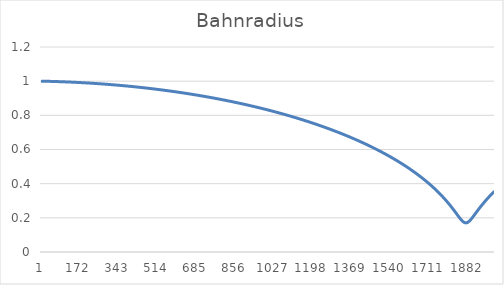
| Category | Series 0 |
|---|---|
| 0 | 1 |
| 1 | 1 |
| 2 | 1 |
| 3 | 1 |
| 4 | 1 |
| 5 | 1 |
| 6 | 1 |
| 7 | 1 |
| 8 | 1 |
| 9 | 1 |
| 10 | 1 |
| 11 | 1 |
| 12 | 1 |
| 13 | 1 |
| 14 | 1 |
| 15 | 1 |
| 16 | 1 |
| 17 | 1 |
| 18 | 1 |
| 19 | 0.999 |
| 20 | 0.999 |
| 21 | 0.999 |
| 22 | 0.999 |
| 23 | 0.999 |
| 24 | 0.999 |
| 25 | 0.999 |
| 26 | 0.999 |
| 27 | 0.999 |
| 28 | 0.999 |
| 29 | 0.999 |
| 30 | 0.999 |
| 31 | 0.999 |
| 32 | 0.999 |
| 33 | 0.999 |
| 34 | 0.999 |
| 35 | 0.999 |
| 36 | 0.999 |
| 37 | 0.999 |
| 38 | 0.999 |
| 39 | 0.999 |
| 40 | 0.999 |
| 41 | 0.999 |
| 42 | 0.999 |
| 43 | 0.999 |
| 44 | 0.999 |
| 45 | 0.999 |
| 46 | 0.999 |
| 47 | 0.999 |
| 48 | 0.998 |
| 49 | 0.998 |
| 50 | 0.998 |
| 51 | 0.998 |
| 52 | 0.998 |
| 53 | 0.998 |
| 54 | 0.998 |
| 55 | 0.998 |
| 56 | 0.998 |
| 57 | 0.998 |
| 58 | 0.998 |
| 59 | 0.998 |
| 60 | 0.998 |
| 61 | 0.998 |
| 62 | 0.998 |
| 63 | 0.998 |
| 64 | 0.998 |
| 65 | 0.998 |
| 66 | 0.998 |
| 67 | 0.998 |
| 68 | 0.998 |
| 69 | 0.998 |
| 70 | 0.998 |
| 71 | 0.998 |
| 72 | 0.998 |
| 73 | 0.997 |
| 74 | 0.997 |
| 75 | 0.997 |
| 76 | 0.997 |
| 77 | 0.997 |
| 78 | 0.997 |
| 79 | 0.997 |
| 80 | 0.997 |
| 81 | 0.997 |
| 82 | 0.997 |
| 83 | 0.997 |
| 84 | 0.997 |
| 85 | 0.997 |
| 86 | 0.997 |
| 87 | 0.997 |
| 88 | 0.997 |
| 89 | 0.997 |
| 90 | 0.997 |
| 91 | 0.997 |
| 92 | 0.997 |
| 93 | 0.997 |
| 94 | 0.996 |
| 95 | 0.996 |
| 96 | 0.996 |
| 97 | 0.996 |
| 98 | 0.996 |
| 99 | 0.996 |
| 100 | 0.996 |
| 101 | 0.996 |
| 102 | 0.996 |
| 103 | 0.996 |
| 104 | 0.996 |
| 105 | 0.996 |
| 106 | 0.996 |
| 107 | 0.996 |
| 108 | 0.996 |
| 109 | 0.996 |
| 110 | 0.996 |
| 111 | 0.996 |
| 112 | 0.996 |
| 113 | 0.995 |
| 114 | 0.995 |
| 115 | 0.995 |
| 116 | 0.995 |
| 117 | 0.995 |
| 118 | 0.995 |
| 119 | 0.995 |
| 120 | 0.995 |
| 121 | 0.995 |
| 122 | 0.995 |
| 123 | 0.995 |
| 124 | 0.995 |
| 125 | 0.995 |
| 126 | 0.995 |
| 127 | 0.995 |
| 128 | 0.995 |
| 129 | 0.995 |
| 130 | 0.995 |
| 131 | 0.994 |
| 132 | 0.994 |
| 133 | 0.994 |
| 134 | 0.994 |
| 135 | 0.994 |
| 136 | 0.994 |
| 137 | 0.994 |
| 138 | 0.994 |
| 139 | 0.994 |
| 140 | 0.994 |
| 141 | 0.994 |
| 142 | 0.994 |
| 143 | 0.994 |
| 144 | 0.994 |
| 145 | 0.994 |
| 146 | 0.994 |
| 147 | 0.993 |
| 148 | 0.993 |
| 149 | 0.993 |
| 150 | 0.993 |
| 151 | 0.993 |
| 152 | 0.993 |
| 153 | 0.993 |
| 154 | 0.993 |
| 155 | 0.993 |
| 156 | 0.993 |
| 157 | 0.993 |
| 158 | 0.993 |
| 159 | 0.993 |
| 160 | 0.993 |
| 161 | 0.993 |
| 162 | 0.992 |
| 163 | 0.992 |
| 164 | 0.992 |
| 165 | 0.992 |
| 166 | 0.992 |
| 167 | 0.992 |
| 168 | 0.992 |
| 169 | 0.992 |
| 170 | 0.992 |
| 171 | 0.992 |
| 172 | 0.992 |
| 173 | 0.992 |
| 174 | 0.992 |
| 175 | 0.992 |
| 176 | 0.992 |
| 177 | 0.991 |
| 178 | 0.991 |
| 179 | 0.991 |
| 180 | 0.991 |
| 181 | 0.991 |
| 182 | 0.991 |
| 183 | 0.991 |
| 184 | 0.991 |
| 185 | 0.991 |
| 186 | 0.991 |
| 187 | 0.991 |
| 188 | 0.991 |
| 189 | 0.991 |
| 190 | 0.99 |
| 191 | 0.99 |
| 192 | 0.99 |
| 193 | 0.99 |
| 194 | 0.99 |
| 195 | 0.99 |
| 196 | 0.99 |
| 197 | 0.99 |
| 198 | 0.99 |
| 199 | 0.99 |
| 200 | 0.99 |
| 201 | 0.99 |
| 202 | 0.99 |
| 203 | 0.989 |
| 204 | 0.989 |
| 205 | 0.989 |
| 206 | 0.989 |
| 207 | 0.989 |
| 208 | 0.989 |
| 209 | 0.989 |
| 210 | 0.989 |
| 211 | 0.989 |
| 212 | 0.989 |
| 213 | 0.989 |
| 214 | 0.989 |
| 215 | 0.989 |
| 216 | 0.988 |
| 217 | 0.988 |
| 218 | 0.988 |
| 219 | 0.988 |
| 220 | 0.988 |
| 221 | 0.988 |
| 222 | 0.988 |
| 223 | 0.988 |
| 224 | 0.988 |
| 225 | 0.988 |
| 226 | 0.988 |
| 227 | 0.988 |
| 228 | 0.987 |
| 229 | 0.987 |
| 230 | 0.987 |
| 231 | 0.987 |
| 232 | 0.987 |
| 233 | 0.987 |
| 234 | 0.987 |
| 235 | 0.987 |
| 236 | 0.987 |
| 237 | 0.987 |
| 238 | 0.987 |
| 239 | 0.986 |
| 240 | 0.986 |
| 241 | 0.986 |
| 242 | 0.986 |
| 243 | 0.986 |
| 244 | 0.986 |
| 245 | 0.986 |
| 246 | 0.986 |
| 247 | 0.986 |
| 248 | 0.986 |
| 249 | 0.986 |
| 250 | 0.986 |
| 251 | 0.985 |
| 252 | 0.985 |
| 253 | 0.985 |
| 254 | 0.985 |
| 255 | 0.985 |
| 256 | 0.985 |
| 257 | 0.985 |
| 258 | 0.985 |
| 259 | 0.985 |
| 260 | 0.985 |
| 261 | 0.984 |
| 262 | 0.984 |
| 263 | 0.984 |
| 264 | 0.984 |
| 265 | 0.984 |
| 266 | 0.984 |
| 267 | 0.984 |
| 268 | 0.984 |
| 269 | 0.984 |
| 270 | 0.984 |
| 271 | 0.984 |
| 272 | 0.983 |
| 273 | 0.983 |
| 274 | 0.983 |
| 275 | 0.983 |
| 276 | 0.983 |
| 277 | 0.983 |
| 278 | 0.983 |
| 279 | 0.983 |
| 280 | 0.983 |
| 281 | 0.983 |
| 282 | 0.982 |
| 283 | 0.982 |
| 284 | 0.982 |
| 285 | 0.982 |
| 286 | 0.982 |
| 287 | 0.982 |
| 288 | 0.982 |
| 289 | 0.982 |
| 290 | 0.982 |
| 291 | 0.982 |
| 292 | 0.981 |
| 293 | 0.981 |
| 294 | 0.981 |
| 295 | 0.981 |
| 296 | 0.981 |
| 297 | 0.981 |
| 298 | 0.981 |
| 299 | 0.981 |
| 300 | 0.981 |
| 301 | 0.98 |
| 302 | 0.98 |
| 303 | 0.98 |
| 304 | 0.98 |
| 305 | 0.98 |
| 306 | 0.98 |
| 307 | 0.98 |
| 308 | 0.98 |
| 309 | 0.98 |
| 310 | 0.98 |
| 311 | 0.979 |
| 312 | 0.979 |
| 313 | 0.979 |
| 314 | 0.979 |
| 315 | 0.979 |
| 316 | 0.979 |
| 317 | 0.979 |
| 318 | 0.979 |
| 319 | 0.979 |
| 320 | 0.978 |
| 321 | 0.978 |
| 322 | 0.978 |
| 323 | 0.978 |
| 324 | 0.978 |
| 325 | 0.978 |
| 326 | 0.978 |
| 327 | 0.978 |
| 328 | 0.978 |
| 329 | 0.977 |
| 330 | 0.977 |
| 331 | 0.977 |
| 332 | 0.977 |
| 333 | 0.977 |
| 334 | 0.977 |
| 335 | 0.977 |
| 336 | 0.977 |
| 337 | 0.977 |
| 338 | 0.976 |
| 339 | 0.976 |
| 340 | 0.976 |
| 341 | 0.976 |
| 342 | 0.976 |
| 343 | 0.976 |
| 344 | 0.976 |
| 345 | 0.976 |
| 346 | 0.975 |
| 347 | 0.975 |
| 348 | 0.975 |
| 349 | 0.975 |
| 350 | 0.975 |
| 351 | 0.975 |
| 352 | 0.975 |
| 353 | 0.975 |
| 354 | 0.975 |
| 355 | 0.974 |
| 356 | 0.974 |
| 357 | 0.974 |
| 358 | 0.974 |
| 359 | 0.974 |
| 360 | 0.974 |
| 361 | 0.974 |
| 362 | 0.974 |
| 363 | 0.973 |
| 364 | 0.973 |
| 365 | 0.973 |
| 366 | 0.973 |
| 367 | 0.973 |
| 368 | 0.973 |
| 369 | 0.973 |
| 370 | 0.973 |
| 371 | 0.972 |
| 372 | 0.972 |
| 373 | 0.972 |
| 374 | 0.972 |
| 375 | 0.972 |
| 376 | 0.972 |
| 377 | 0.972 |
| 378 | 0.972 |
| 379 | 0.971 |
| 380 | 0.971 |
| 381 | 0.971 |
| 382 | 0.971 |
| 383 | 0.971 |
| 384 | 0.971 |
| 385 | 0.971 |
| 386 | 0.971 |
| 387 | 0.97 |
| 388 | 0.97 |
| 389 | 0.97 |
| 390 | 0.97 |
| 391 | 0.97 |
| 392 | 0.97 |
| 393 | 0.97 |
| 394 | 0.97 |
| 395 | 0.969 |
| 396 | 0.969 |
| 397 | 0.969 |
| 398 | 0.969 |
| 399 | 0.969 |
| 400 | 0.969 |
| 401 | 0.969 |
| 402 | 0.968 |
| 403 | 0.968 |
| 404 | 0.968 |
| 405 | 0.968 |
| 406 | 0.968 |
| 407 | 0.968 |
| 408 | 0.968 |
| 409 | 0.968 |
| 410 | 0.967 |
| 411 | 0.967 |
| 412 | 0.967 |
| 413 | 0.967 |
| 414 | 0.967 |
| 415 | 0.967 |
| 416 | 0.967 |
| 417 | 0.966 |
| 418 | 0.966 |
| 419 | 0.966 |
| 420 | 0.966 |
| 421 | 0.966 |
| 422 | 0.966 |
| 423 | 0.966 |
| 424 | 0.965 |
| 425 | 0.965 |
| 426 | 0.965 |
| 427 | 0.965 |
| 428 | 0.965 |
| 429 | 0.965 |
| 430 | 0.965 |
| 431 | 0.964 |
| 432 | 0.964 |
| 433 | 0.964 |
| 434 | 0.964 |
| 435 | 0.964 |
| 436 | 0.964 |
| 437 | 0.964 |
| 438 | 0.963 |
| 439 | 0.963 |
| 440 | 0.963 |
| 441 | 0.963 |
| 442 | 0.963 |
| 443 | 0.963 |
| 444 | 0.963 |
| 445 | 0.962 |
| 446 | 0.962 |
| 447 | 0.962 |
| 448 | 0.962 |
| 449 | 0.962 |
| 450 | 0.962 |
| 451 | 0.962 |
| 452 | 0.961 |
| 453 | 0.961 |
| 454 | 0.961 |
| 455 | 0.961 |
| 456 | 0.961 |
| 457 | 0.961 |
| 458 | 0.961 |
| 459 | 0.96 |
| 460 | 0.96 |
| 461 | 0.96 |
| 462 | 0.96 |
| 463 | 0.96 |
| 464 | 0.96 |
| 465 | 0.959 |
| 466 | 0.959 |
| 467 | 0.959 |
| 468 | 0.959 |
| 469 | 0.959 |
| 470 | 0.959 |
| 471 | 0.959 |
| 472 | 0.958 |
| 473 | 0.958 |
| 474 | 0.958 |
| 475 | 0.958 |
| 476 | 0.958 |
| 477 | 0.958 |
| 478 | 0.957 |
| 479 | 0.957 |
| 480 | 0.957 |
| 481 | 0.957 |
| 482 | 0.957 |
| 483 | 0.957 |
| 484 | 0.957 |
| 485 | 0.956 |
| 486 | 0.956 |
| 487 | 0.956 |
| 488 | 0.956 |
| 489 | 0.956 |
| 490 | 0.956 |
| 491 | 0.955 |
| 492 | 0.955 |
| 493 | 0.955 |
| 494 | 0.955 |
| 495 | 0.955 |
| 496 | 0.955 |
| 497 | 0.954 |
| 498 | 0.954 |
| 499 | 0.954 |
| 500 | 0.954 |
| 501 | 0.954 |
| 502 | 0.954 |
| 503 | 0.953 |
| 504 | 0.953 |
| 505 | 0.953 |
| 506 | 0.953 |
| 507 | 0.953 |
| 508 | 0.953 |
| 509 | 0.953 |
| 510 | 0.952 |
| 511 | 0.952 |
| 512 | 0.952 |
| 513 | 0.952 |
| 514 | 0.952 |
| 515 | 0.952 |
| 516 | 0.951 |
| 517 | 0.951 |
| 518 | 0.951 |
| 519 | 0.951 |
| 520 | 0.951 |
| 521 | 0.951 |
| 522 | 0.95 |
| 523 | 0.95 |
| 524 | 0.95 |
| 525 | 0.95 |
| 526 | 0.95 |
| 527 | 0.949 |
| 528 | 0.949 |
| 529 | 0.949 |
| 530 | 0.949 |
| 531 | 0.949 |
| 532 | 0.949 |
| 533 | 0.948 |
| 534 | 0.948 |
| 535 | 0.948 |
| 536 | 0.948 |
| 537 | 0.948 |
| 538 | 0.948 |
| 539 | 0.947 |
| 540 | 0.947 |
| 541 | 0.947 |
| 542 | 0.947 |
| 543 | 0.947 |
| 544 | 0.947 |
| 545 | 0.946 |
| 546 | 0.946 |
| 547 | 0.946 |
| 548 | 0.946 |
| 549 | 0.946 |
| 550 | 0.945 |
| 551 | 0.945 |
| 552 | 0.945 |
| 553 | 0.945 |
| 554 | 0.945 |
| 555 | 0.945 |
| 556 | 0.944 |
| 557 | 0.944 |
| 558 | 0.944 |
| 559 | 0.944 |
| 560 | 0.944 |
| 561 | 0.944 |
| 562 | 0.943 |
| 563 | 0.943 |
| 564 | 0.943 |
| 565 | 0.943 |
| 566 | 0.943 |
| 567 | 0.942 |
| 568 | 0.942 |
| 569 | 0.942 |
| 570 | 0.942 |
| 571 | 0.942 |
| 572 | 0.942 |
| 573 | 0.941 |
| 574 | 0.941 |
| 575 | 0.941 |
| 576 | 0.941 |
| 577 | 0.941 |
| 578 | 0.94 |
| 579 | 0.94 |
| 580 | 0.94 |
| 581 | 0.94 |
| 582 | 0.94 |
| 583 | 0.939 |
| 584 | 0.939 |
| 585 | 0.939 |
| 586 | 0.939 |
| 587 | 0.939 |
| 588 | 0.939 |
| 589 | 0.938 |
| 590 | 0.938 |
| 591 | 0.938 |
| 592 | 0.938 |
| 593 | 0.938 |
| 594 | 0.937 |
| 595 | 0.937 |
| 596 | 0.937 |
| 597 | 0.937 |
| 598 | 0.937 |
| 599 | 0.936 |
| 600 | 0.936 |
| 601 | 0.936 |
| 602 | 0.936 |
| 603 | 0.936 |
| 604 | 0.935 |
| 605 | 0.935 |
| 606 | 0.935 |
| 607 | 0.935 |
| 608 | 0.935 |
| 609 | 0.934 |
| 610 | 0.934 |
| 611 | 0.934 |
| 612 | 0.934 |
| 613 | 0.934 |
| 614 | 0.934 |
| 615 | 0.933 |
| 616 | 0.933 |
| 617 | 0.933 |
| 618 | 0.933 |
| 619 | 0.933 |
| 620 | 0.932 |
| 621 | 0.932 |
| 622 | 0.932 |
| 623 | 0.932 |
| 624 | 0.932 |
| 625 | 0.931 |
| 626 | 0.931 |
| 627 | 0.931 |
| 628 | 0.931 |
| 629 | 0.931 |
| 630 | 0.93 |
| 631 | 0.93 |
| 632 | 0.93 |
| 633 | 0.93 |
| 634 | 0.929 |
| 635 | 0.929 |
| 636 | 0.929 |
| 637 | 0.929 |
| 638 | 0.929 |
| 639 | 0.928 |
| 640 | 0.928 |
| 641 | 0.928 |
| 642 | 0.928 |
| 643 | 0.928 |
| 644 | 0.927 |
| 645 | 0.927 |
| 646 | 0.927 |
| 647 | 0.927 |
| 648 | 0.927 |
| 649 | 0.926 |
| 650 | 0.926 |
| 651 | 0.926 |
| 652 | 0.926 |
| 653 | 0.926 |
| 654 | 0.925 |
| 655 | 0.925 |
| 656 | 0.925 |
| 657 | 0.925 |
| 658 | 0.925 |
| 659 | 0.924 |
| 660 | 0.924 |
| 661 | 0.924 |
| 662 | 0.924 |
| 663 | 0.923 |
| 664 | 0.923 |
| 665 | 0.923 |
| 666 | 0.923 |
| 667 | 0.923 |
| 668 | 0.922 |
| 669 | 0.922 |
| 670 | 0.922 |
| 671 | 0.922 |
| 672 | 0.922 |
| 673 | 0.921 |
| 674 | 0.921 |
| 675 | 0.921 |
| 676 | 0.921 |
| 677 | 0.92 |
| 678 | 0.92 |
| 679 | 0.92 |
| 680 | 0.92 |
| 681 | 0.92 |
| 682 | 0.919 |
| 683 | 0.919 |
| 684 | 0.919 |
| 685 | 0.919 |
| 686 | 0.918 |
| 687 | 0.918 |
| 688 | 0.918 |
| 689 | 0.918 |
| 690 | 0.918 |
| 691 | 0.917 |
| 692 | 0.917 |
| 693 | 0.917 |
| 694 | 0.917 |
| 695 | 0.916 |
| 696 | 0.916 |
| 697 | 0.916 |
| 698 | 0.916 |
| 699 | 0.916 |
| 700 | 0.915 |
| 701 | 0.915 |
| 702 | 0.915 |
| 703 | 0.915 |
| 704 | 0.914 |
| 705 | 0.914 |
| 706 | 0.914 |
| 707 | 0.914 |
| 708 | 0.914 |
| 709 | 0.913 |
| 710 | 0.913 |
| 711 | 0.913 |
| 712 | 0.913 |
| 713 | 0.912 |
| 714 | 0.912 |
| 715 | 0.912 |
| 716 | 0.912 |
| 717 | 0.911 |
| 718 | 0.911 |
| 719 | 0.911 |
| 720 | 0.911 |
| 721 | 0.911 |
| 722 | 0.91 |
| 723 | 0.91 |
| 724 | 0.91 |
| 725 | 0.91 |
| 726 | 0.909 |
| 727 | 0.909 |
| 728 | 0.909 |
| 729 | 0.909 |
| 730 | 0.908 |
| 731 | 0.908 |
| 732 | 0.908 |
| 733 | 0.908 |
| 734 | 0.907 |
| 735 | 0.907 |
| 736 | 0.907 |
| 737 | 0.907 |
| 738 | 0.907 |
| 739 | 0.906 |
| 740 | 0.906 |
| 741 | 0.906 |
| 742 | 0.906 |
| 743 | 0.905 |
| 744 | 0.905 |
| 745 | 0.905 |
| 746 | 0.905 |
| 747 | 0.904 |
| 748 | 0.904 |
| 749 | 0.904 |
| 750 | 0.904 |
| 751 | 0.903 |
| 752 | 0.903 |
| 753 | 0.903 |
| 754 | 0.903 |
| 755 | 0.902 |
| 756 | 0.902 |
| 757 | 0.902 |
| 758 | 0.902 |
| 759 | 0.901 |
| 760 | 0.901 |
| 761 | 0.901 |
| 762 | 0.901 |
| 763 | 0.9 |
| 764 | 0.9 |
| 765 | 0.9 |
| 766 | 0.9 |
| 767 | 0.899 |
| 768 | 0.899 |
| 769 | 0.899 |
| 770 | 0.899 |
| 771 | 0.898 |
| 772 | 0.898 |
| 773 | 0.898 |
| 774 | 0.898 |
| 775 | 0.897 |
| 776 | 0.897 |
| 777 | 0.897 |
| 778 | 0.897 |
| 779 | 0.896 |
| 780 | 0.896 |
| 781 | 0.896 |
| 782 | 0.896 |
| 783 | 0.895 |
| 784 | 0.895 |
| 785 | 0.895 |
| 786 | 0.895 |
| 787 | 0.894 |
| 788 | 0.894 |
| 789 | 0.894 |
| 790 | 0.894 |
| 791 | 0.893 |
| 792 | 0.893 |
| 793 | 0.893 |
| 794 | 0.893 |
| 795 | 0.892 |
| 796 | 0.892 |
| 797 | 0.892 |
| 798 | 0.892 |
| 799 | 0.891 |
| 800 | 0.891 |
| 801 | 0.891 |
| 802 | 0.891 |
| 803 | 0.89 |
| 804 | 0.89 |
| 805 | 0.89 |
| 806 | 0.889 |
| 807 | 0.889 |
| 808 | 0.889 |
| 809 | 0.889 |
| 810 | 0.888 |
| 811 | 0.888 |
| 812 | 0.888 |
| 813 | 0.888 |
| 814 | 0.887 |
| 815 | 0.887 |
| 816 | 0.887 |
| 817 | 0.887 |
| 818 | 0.886 |
| 819 | 0.886 |
| 820 | 0.886 |
| 821 | 0.885 |
| 822 | 0.885 |
| 823 | 0.885 |
| 824 | 0.885 |
| 825 | 0.884 |
| 826 | 0.884 |
| 827 | 0.884 |
| 828 | 0.884 |
| 829 | 0.883 |
| 830 | 0.883 |
| 831 | 0.883 |
| 832 | 0.883 |
| 833 | 0.882 |
| 834 | 0.882 |
| 835 | 0.882 |
| 836 | 0.881 |
| 837 | 0.881 |
| 838 | 0.881 |
| 839 | 0.881 |
| 840 | 0.88 |
| 841 | 0.88 |
| 842 | 0.88 |
| 843 | 0.879 |
| 844 | 0.879 |
| 845 | 0.879 |
| 846 | 0.879 |
| 847 | 0.878 |
| 848 | 0.878 |
| 849 | 0.878 |
| 850 | 0.878 |
| 851 | 0.877 |
| 852 | 0.877 |
| 853 | 0.877 |
| 854 | 0.876 |
| 855 | 0.876 |
| 856 | 0.876 |
| 857 | 0.876 |
| 858 | 0.875 |
| 859 | 0.875 |
| 860 | 0.875 |
| 861 | 0.874 |
| 862 | 0.874 |
| 863 | 0.874 |
| 864 | 0.874 |
| 865 | 0.873 |
| 866 | 0.873 |
| 867 | 0.873 |
| 868 | 0.872 |
| 869 | 0.872 |
| 870 | 0.872 |
| 871 | 0.872 |
| 872 | 0.871 |
| 873 | 0.871 |
| 874 | 0.871 |
| 875 | 0.87 |
| 876 | 0.87 |
| 877 | 0.87 |
| 878 | 0.87 |
| 879 | 0.869 |
| 880 | 0.869 |
| 881 | 0.869 |
| 882 | 0.868 |
| 883 | 0.868 |
| 884 | 0.868 |
| 885 | 0.868 |
| 886 | 0.867 |
| 887 | 0.867 |
| 888 | 0.867 |
| 889 | 0.866 |
| 890 | 0.866 |
| 891 | 0.866 |
| 892 | 0.865 |
| 893 | 0.865 |
| 894 | 0.865 |
| 895 | 0.865 |
| 896 | 0.864 |
| 897 | 0.864 |
| 898 | 0.864 |
| 899 | 0.863 |
| 900 | 0.863 |
| 901 | 0.863 |
| 902 | 0.862 |
| 903 | 0.862 |
| 904 | 0.862 |
| 905 | 0.862 |
| 906 | 0.861 |
| 907 | 0.861 |
| 908 | 0.861 |
| 909 | 0.86 |
| 910 | 0.86 |
| 911 | 0.86 |
| 912 | 0.859 |
| 913 | 0.859 |
| 914 | 0.859 |
| 915 | 0.859 |
| 916 | 0.858 |
| 917 | 0.858 |
| 918 | 0.858 |
| 919 | 0.857 |
| 920 | 0.857 |
| 921 | 0.857 |
| 922 | 0.856 |
| 923 | 0.856 |
| 924 | 0.856 |
| 925 | 0.855 |
| 926 | 0.855 |
| 927 | 0.855 |
| 928 | 0.855 |
| 929 | 0.854 |
| 930 | 0.854 |
| 931 | 0.854 |
| 932 | 0.853 |
| 933 | 0.853 |
| 934 | 0.853 |
| 935 | 0.852 |
| 936 | 0.852 |
| 937 | 0.852 |
| 938 | 0.851 |
| 939 | 0.851 |
| 940 | 0.851 |
| 941 | 0.85 |
| 942 | 0.85 |
| 943 | 0.85 |
| 944 | 0.85 |
| 945 | 0.849 |
| 946 | 0.849 |
| 947 | 0.849 |
| 948 | 0.848 |
| 949 | 0.848 |
| 950 | 0.848 |
| 951 | 0.847 |
| 952 | 0.847 |
| 953 | 0.847 |
| 954 | 0.846 |
| 955 | 0.846 |
| 956 | 0.846 |
| 957 | 0.845 |
| 958 | 0.845 |
| 959 | 0.845 |
| 960 | 0.844 |
| 961 | 0.844 |
| 962 | 0.844 |
| 963 | 0.843 |
| 964 | 0.843 |
| 965 | 0.843 |
| 966 | 0.842 |
| 967 | 0.842 |
| 968 | 0.842 |
| 969 | 0.841 |
| 970 | 0.841 |
| 971 | 0.841 |
| 972 | 0.84 |
| 973 | 0.84 |
| 974 | 0.84 |
| 975 | 0.839 |
| 976 | 0.839 |
| 977 | 0.839 |
| 978 | 0.838 |
| 979 | 0.838 |
| 980 | 0.838 |
| 981 | 0.837 |
| 982 | 0.837 |
| 983 | 0.837 |
| 984 | 0.836 |
| 985 | 0.836 |
| 986 | 0.836 |
| 987 | 0.835 |
| 988 | 0.835 |
| 989 | 0.835 |
| 990 | 0.834 |
| 991 | 0.834 |
| 992 | 0.834 |
| 993 | 0.833 |
| 994 | 0.833 |
| 995 | 0.833 |
| 996 | 0.832 |
| 997 | 0.832 |
| 998 | 0.832 |
| 999 | 0.831 |
| 1000 | 0.831 |
| 1001 | 0.831 |
| 1002 | 0.83 |
| 1003 | 0.83 |
| 1004 | 0.83 |
| 1005 | 0.829 |
| 1006 | 0.829 |
| 1007 | 0.829 |
| 1008 | 0.828 |
| 1009 | 0.828 |
| 1010 | 0.828 |
| 1011 | 0.827 |
| 1012 | 0.827 |
| 1013 | 0.827 |
| 1014 | 0.826 |
| 1015 | 0.826 |
| 1016 | 0.826 |
| 1017 | 0.825 |
| 1018 | 0.825 |
| 1019 | 0.825 |
| 1020 | 0.824 |
| 1021 | 0.824 |
| 1022 | 0.823 |
| 1023 | 0.823 |
| 1024 | 0.823 |
| 1025 | 0.822 |
| 1026 | 0.822 |
| 1027 | 0.822 |
| 1028 | 0.821 |
| 1029 | 0.821 |
| 1030 | 0.821 |
| 1031 | 0.82 |
| 1032 | 0.82 |
| 1033 | 0.82 |
| 1034 | 0.819 |
| 1035 | 0.819 |
| 1036 | 0.818 |
| 1037 | 0.818 |
| 1038 | 0.818 |
| 1039 | 0.817 |
| 1040 | 0.817 |
| 1041 | 0.817 |
| 1042 | 0.816 |
| 1043 | 0.816 |
| 1044 | 0.816 |
| 1045 | 0.815 |
| 1046 | 0.815 |
| 1047 | 0.815 |
| 1048 | 0.814 |
| 1049 | 0.814 |
| 1050 | 0.813 |
| 1051 | 0.813 |
| 1052 | 0.813 |
| 1053 | 0.812 |
| 1054 | 0.812 |
| 1055 | 0.812 |
| 1056 | 0.811 |
| 1057 | 0.811 |
| 1058 | 0.81 |
| 1059 | 0.81 |
| 1060 | 0.81 |
| 1061 | 0.809 |
| 1062 | 0.809 |
| 1063 | 0.809 |
| 1064 | 0.808 |
| 1065 | 0.808 |
| 1066 | 0.808 |
| 1067 | 0.807 |
| 1068 | 0.807 |
| 1069 | 0.806 |
| 1070 | 0.806 |
| 1071 | 0.806 |
| 1072 | 0.805 |
| 1073 | 0.805 |
| 1074 | 0.805 |
| 1075 | 0.804 |
| 1076 | 0.804 |
| 1077 | 0.803 |
| 1078 | 0.803 |
| 1079 | 0.803 |
| 1080 | 0.802 |
| 1081 | 0.802 |
| 1082 | 0.801 |
| 1083 | 0.801 |
| 1084 | 0.801 |
| 1085 | 0.8 |
| 1086 | 0.8 |
| 1087 | 0.8 |
| 1088 | 0.799 |
| 1089 | 0.799 |
| 1090 | 0.798 |
| 1091 | 0.798 |
| 1092 | 0.798 |
| 1093 | 0.797 |
| 1094 | 0.797 |
| 1095 | 0.796 |
| 1096 | 0.796 |
| 1097 | 0.796 |
| 1098 | 0.795 |
| 1099 | 0.795 |
| 1100 | 0.795 |
| 1101 | 0.794 |
| 1102 | 0.794 |
| 1103 | 0.793 |
| 1104 | 0.793 |
| 1105 | 0.793 |
| 1106 | 0.792 |
| 1107 | 0.792 |
| 1108 | 0.791 |
| 1109 | 0.791 |
| 1110 | 0.791 |
| 1111 | 0.79 |
| 1112 | 0.79 |
| 1113 | 0.789 |
| 1114 | 0.789 |
| 1115 | 0.789 |
| 1116 | 0.788 |
| 1117 | 0.788 |
| 1118 | 0.787 |
| 1119 | 0.787 |
| 1120 | 0.787 |
| 1121 | 0.786 |
| 1122 | 0.786 |
| 1123 | 0.785 |
| 1124 | 0.785 |
| 1125 | 0.785 |
| 1126 | 0.784 |
| 1127 | 0.784 |
| 1128 | 0.783 |
| 1129 | 0.783 |
| 1130 | 0.783 |
| 1131 | 0.782 |
| 1132 | 0.782 |
| 1133 | 0.781 |
| 1134 | 0.781 |
| 1135 | 0.781 |
| 1136 | 0.78 |
| 1137 | 0.78 |
| 1138 | 0.779 |
| 1139 | 0.779 |
| 1140 | 0.779 |
| 1141 | 0.778 |
| 1142 | 0.778 |
| 1143 | 0.777 |
| 1144 | 0.777 |
| 1145 | 0.776 |
| 1146 | 0.776 |
| 1147 | 0.776 |
| 1148 | 0.775 |
| 1149 | 0.775 |
| 1150 | 0.774 |
| 1151 | 0.774 |
| 1152 | 0.774 |
| 1153 | 0.773 |
| 1154 | 0.773 |
| 1155 | 0.772 |
| 1156 | 0.772 |
| 1157 | 0.771 |
| 1158 | 0.771 |
| 1159 | 0.771 |
| 1160 | 0.77 |
| 1161 | 0.77 |
| 1162 | 0.769 |
| 1163 | 0.769 |
| 1164 | 0.769 |
| 1165 | 0.768 |
| 1166 | 0.768 |
| 1167 | 0.767 |
| 1168 | 0.767 |
| 1169 | 0.766 |
| 1170 | 0.766 |
| 1171 | 0.766 |
| 1172 | 0.765 |
| 1173 | 0.765 |
| 1174 | 0.764 |
| 1175 | 0.764 |
| 1176 | 0.763 |
| 1177 | 0.763 |
| 1178 | 0.763 |
| 1179 | 0.762 |
| 1180 | 0.762 |
| 1181 | 0.761 |
| 1182 | 0.761 |
| 1183 | 0.76 |
| 1184 | 0.76 |
| 1185 | 0.759 |
| 1186 | 0.759 |
| 1187 | 0.759 |
| 1188 | 0.758 |
| 1189 | 0.758 |
| 1190 | 0.757 |
| 1191 | 0.757 |
| 1192 | 0.756 |
| 1193 | 0.756 |
| 1194 | 0.756 |
| 1195 | 0.755 |
| 1196 | 0.755 |
| 1197 | 0.754 |
| 1198 | 0.754 |
| 1199 | 0.753 |
| 1200 | 0.753 |
| 1201 | 0.752 |
| 1202 | 0.752 |
| 1203 | 0.752 |
| 1204 | 0.751 |
| 1205 | 0.751 |
| 1206 | 0.75 |
| 1207 | 0.75 |
| 1208 | 0.749 |
| 1209 | 0.749 |
| 1210 | 0.748 |
| 1211 | 0.748 |
| 1212 | 0.747 |
| 1213 | 0.747 |
| 1214 | 0.747 |
| 1215 | 0.746 |
| 1216 | 0.746 |
| 1217 | 0.745 |
| 1218 | 0.745 |
| 1219 | 0.744 |
| 1220 | 0.744 |
| 1221 | 0.743 |
| 1222 | 0.743 |
| 1223 | 0.742 |
| 1224 | 0.742 |
| 1225 | 0.742 |
| 1226 | 0.741 |
| 1227 | 0.741 |
| 1228 | 0.74 |
| 1229 | 0.74 |
| 1230 | 0.739 |
| 1231 | 0.739 |
| 1232 | 0.738 |
| 1233 | 0.738 |
| 1234 | 0.737 |
| 1235 | 0.737 |
| 1236 | 0.736 |
| 1237 | 0.736 |
| 1238 | 0.735 |
| 1239 | 0.735 |
| 1240 | 0.735 |
| 1241 | 0.734 |
| 1242 | 0.734 |
| 1243 | 0.733 |
| 1244 | 0.733 |
| 1245 | 0.732 |
| 1246 | 0.732 |
| 1247 | 0.731 |
| 1248 | 0.731 |
| 1249 | 0.73 |
| 1250 | 0.73 |
| 1251 | 0.729 |
| 1252 | 0.729 |
| 1253 | 0.728 |
| 1254 | 0.728 |
| 1255 | 0.727 |
| 1256 | 0.727 |
| 1257 | 0.726 |
| 1258 | 0.726 |
| 1259 | 0.725 |
| 1260 | 0.725 |
| 1261 | 0.724 |
| 1262 | 0.724 |
| 1263 | 0.724 |
| 1264 | 0.723 |
| 1265 | 0.723 |
| 1266 | 0.722 |
| 1267 | 0.722 |
| 1268 | 0.721 |
| 1269 | 0.721 |
| 1270 | 0.72 |
| 1271 | 0.72 |
| 1272 | 0.719 |
| 1273 | 0.719 |
| 1274 | 0.718 |
| 1275 | 0.718 |
| 1276 | 0.717 |
| 1277 | 0.717 |
| 1278 | 0.716 |
| 1279 | 0.716 |
| 1280 | 0.715 |
| 1281 | 0.715 |
| 1282 | 0.714 |
| 1283 | 0.714 |
| 1284 | 0.713 |
| 1285 | 0.713 |
| 1286 | 0.712 |
| 1287 | 0.712 |
| 1288 | 0.711 |
| 1289 | 0.711 |
| 1290 | 0.71 |
| 1291 | 0.71 |
| 1292 | 0.709 |
| 1293 | 0.709 |
| 1294 | 0.708 |
| 1295 | 0.708 |
| 1296 | 0.707 |
| 1297 | 0.707 |
| 1298 | 0.706 |
| 1299 | 0.706 |
| 1300 | 0.705 |
| 1301 | 0.705 |
| 1302 | 0.704 |
| 1303 | 0.704 |
| 1304 | 0.703 |
| 1305 | 0.702 |
| 1306 | 0.702 |
| 1307 | 0.701 |
| 1308 | 0.701 |
| 1309 | 0.7 |
| 1310 | 0.7 |
| 1311 | 0.699 |
| 1312 | 0.699 |
| 1313 | 0.698 |
| 1314 | 0.698 |
| 1315 | 0.697 |
| 1316 | 0.697 |
| 1317 | 0.696 |
| 1318 | 0.696 |
| 1319 | 0.695 |
| 1320 | 0.695 |
| 1321 | 0.694 |
| 1322 | 0.694 |
| 1323 | 0.693 |
| 1324 | 0.693 |
| 1325 | 0.692 |
| 1326 | 0.691 |
| 1327 | 0.691 |
| 1328 | 0.69 |
| 1329 | 0.69 |
| 1330 | 0.689 |
| 1331 | 0.689 |
| 1332 | 0.688 |
| 1333 | 0.688 |
| 1334 | 0.687 |
| 1335 | 0.687 |
| 1336 | 0.686 |
| 1337 | 0.686 |
| 1338 | 0.685 |
| 1339 | 0.685 |
| 1340 | 0.684 |
| 1341 | 0.683 |
| 1342 | 0.683 |
| 1343 | 0.682 |
| 1344 | 0.682 |
| 1345 | 0.681 |
| 1346 | 0.681 |
| 1347 | 0.68 |
| 1348 | 0.68 |
| 1349 | 0.679 |
| 1350 | 0.678 |
| 1351 | 0.678 |
| 1352 | 0.677 |
| 1353 | 0.677 |
| 1354 | 0.676 |
| 1355 | 0.676 |
| 1356 | 0.675 |
| 1357 | 0.675 |
| 1358 | 0.674 |
| 1359 | 0.673 |
| 1360 | 0.673 |
| 1361 | 0.672 |
| 1362 | 0.672 |
| 1363 | 0.671 |
| 1364 | 0.671 |
| 1365 | 0.67 |
| 1366 | 0.67 |
| 1367 | 0.669 |
| 1368 | 0.668 |
| 1369 | 0.668 |
| 1370 | 0.667 |
| 1371 | 0.667 |
| 1372 | 0.666 |
| 1373 | 0.666 |
| 1374 | 0.665 |
| 1375 | 0.664 |
| 1376 | 0.664 |
| 1377 | 0.663 |
| 1378 | 0.663 |
| 1379 | 0.662 |
| 1380 | 0.662 |
| 1381 | 0.661 |
| 1382 | 0.66 |
| 1383 | 0.66 |
| 1384 | 0.659 |
| 1385 | 0.659 |
| 1386 | 0.658 |
| 1387 | 0.658 |
| 1388 | 0.657 |
| 1389 | 0.656 |
| 1390 | 0.656 |
| 1391 | 0.655 |
| 1392 | 0.655 |
| 1393 | 0.654 |
| 1394 | 0.653 |
| 1395 | 0.653 |
| 1396 | 0.652 |
| 1397 | 0.652 |
| 1398 | 0.651 |
| 1399 | 0.65 |
| 1400 | 0.65 |
| 1401 | 0.649 |
| 1402 | 0.649 |
| 1403 | 0.648 |
| 1404 | 0.647 |
| 1405 | 0.647 |
| 1406 | 0.646 |
| 1407 | 0.646 |
| 1408 | 0.645 |
| 1409 | 0.644 |
| 1410 | 0.644 |
| 1411 | 0.643 |
| 1412 | 0.643 |
| 1413 | 0.642 |
| 1414 | 0.641 |
| 1415 | 0.641 |
| 1416 | 0.64 |
| 1417 | 0.64 |
| 1418 | 0.639 |
| 1419 | 0.638 |
| 1420 | 0.638 |
| 1421 | 0.637 |
| 1422 | 0.637 |
| 1423 | 0.636 |
| 1424 | 0.635 |
| 1425 | 0.635 |
| 1426 | 0.634 |
| 1427 | 0.633 |
| 1428 | 0.633 |
| 1429 | 0.632 |
| 1430 | 0.632 |
| 1431 | 0.631 |
| 1432 | 0.63 |
| 1433 | 0.63 |
| 1434 | 0.629 |
| 1435 | 0.628 |
| 1436 | 0.628 |
| 1437 | 0.627 |
| 1438 | 0.627 |
| 1439 | 0.626 |
| 1440 | 0.625 |
| 1441 | 0.625 |
| 1442 | 0.624 |
| 1443 | 0.623 |
| 1444 | 0.623 |
| 1445 | 0.622 |
| 1446 | 0.621 |
| 1447 | 0.621 |
| 1448 | 0.62 |
| 1449 | 0.62 |
| 1450 | 0.619 |
| 1451 | 0.618 |
| 1452 | 0.618 |
| 1453 | 0.617 |
| 1454 | 0.616 |
| 1455 | 0.616 |
| 1456 | 0.615 |
| 1457 | 0.614 |
| 1458 | 0.614 |
| 1459 | 0.613 |
| 1460 | 0.612 |
| 1461 | 0.612 |
| 1462 | 0.611 |
| 1463 | 0.61 |
| 1464 | 0.61 |
| 1465 | 0.609 |
| 1466 | 0.608 |
| 1467 | 0.608 |
| 1468 | 0.607 |
| 1469 | 0.606 |
| 1470 | 0.606 |
| 1471 | 0.605 |
| 1472 | 0.604 |
| 1473 | 0.604 |
| 1474 | 0.603 |
| 1475 | 0.602 |
| 1476 | 0.602 |
| 1477 | 0.601 |
| 1478 | 0.6 |
| 1479 | 0.6 |
| 1480 | 0.599 |
| 1481 | 0.598 |
| 1482 | 0.598 |
| 1483 | 0.597 |
| 1484 | 0.596 |
| 1485 | 0.596 |
| 1486 | 0.595 |
| 1487 | 0.594 |
| 1488 | 0.594 |
| 1489 | 0.593 |
| 1490 | 0.592 |
| 1491 | 0.591 |
| 1492 | 0.591 |
| 1493 | 0.59 |
| 1494 | 0.589 |
| 1495 | 0.589 |
| 1496 | 0.588 |
| 1497 | 0.587 |
| 1498 | 0.587 |
| 1499 | 0.586 |
| 1500 | 0.585 |
| 1501 | 0.584 |
| 1502 | 0.584 |
| 1503 | 0.583 |
| 1504 | 0.582 |
| 1505 | 0.582 |
| 1506 | 0.581 |
| 1507 | 0.58 |
| 1508 | 0.58 |
| 1509 | 0.579 |
| 1510 | 0.578 |
| 1511 | 0.577 |
| 1512 | 0.577 |
| 1513 | 0.576 |
| 1514 | 0.575 |
| 1515 | 0.574 |
| 1516 | 0.574 |
| 1517 | 0.573 |
| 1518 | 0.572 |
| 1519 | 0.572 |
| 1520 | 0.571 |
| 1521 | 0.57 |
| 1522 | 0.569 |
| 1523 | 0.569 |
| 1524 | 0.568 |
| 1525 | 0.567 |
| 1526 | 0.566 |
| 1527 | 0.566 |
| 1528 | 0.565 |
| 1529 | 0.564 |
| 1530 | 0.563 |
| 1531 | 0.563 |
| 1532 | 0.562 |
| 1533 | 0.561 |
| 1534 | 0.56 |
| 1535 | 0.56 |
| 1536 | 0.559 |
| 1537 | 0.558 |
| 1538 | 0.557 |
| 1539 | 0.557 |
| 1540 | 0.556 |
| 1541 | 0.555 |
| 1542 | 0.554 |
| 1543 | 0.554 |
| 1544 | 0.553 |
| 1545 | 0.552 |
| 1546 | 0.551 |
| 1547 | 0.551 |
| 1548 | 0.55 |
| 1549 | 0.549 |
| 1550 | 0.548 |
| 1551 | 0.548 |
| 1552 | 0.547 |
| 1553 | 0.546 |
| 1554 | 0.545 |
| 1555 | 0.544 |
| 1556 | 0.544 |
| 1557 | 0.543 |
| 1558 | 0.542 |
| 1559 | 0.541 |
| 1560 | 0.54 |
| 1561 | 0.54 |
| 1562 | 0.539 |
| 1563 | 0.538 |
| 1564 | 0.537 |
| 1565 | 0.537 |
| 1566 | 0.536 |
| 1567 | 0.535 |
| 1568 | 0.534 |
| 1569 | 0.533 |
| 1570 | 0.533 |
| 1571 | 0.532 |
| 1572 | 0.531 |
| 1573 | 0.53 |
| 1574 | 0.529 |
| 1575 | 0.528 |
| 1576 | 0.528 |
| 1577 | 0.527 |
| 1578 | 0.526 |
| 1579 | 0.525 |
| 1580 | 0.524 |
| 1581 | 0.524 |
| 1582 | 0.523 |
| 1583 | 0.522 |
| 1584 | 0.521 |
| 1585 | 0.52 |
| 1586 | 0.519 |
| 1587 | 0.519 |
| 1588 | 0.518 |
| 1589 | 0.517 |
| 1590 | 0.516 |
| 1591 | 0.515 |
| 1592 | 0.514 |
| 1593 | 0.514 |
| 1594 | 0.513 |
| 1595 | 0.512 |
| 1596 | 0.511 |
| 1597 | 0.51 |
| 1598 | 0.509 |
| 1599 | 0.508 |
| 1600 | 0.508 |
| 1601 | 0.507 |
| 1602 | 0.506 |
| 1603 | 0.505 |
| 1604 | 0.504 |
| 1605 | 0.503 |
| 1606 | 0.502 |
| 1607 | 0.501 |
| 1608 | 0.501 |
| 1609 | 0.5 |
| 1610 | 0.499 |
| 1611 | 0.498 |
| 1612 | 0.497 |
| 1613 | 0.496 |
| 1614 | 0.495 |
| 1615 | 0.494 |
| 1616 | 0.494 |
| 1617 | 0.493 |
| 1618 | 0.492 |
| 1619 | 0.491 |
| 1620 | 0.49 |
| 1621 | 0.489 |
| 1622 | 0.488 |
| 1623 | 0.487 |
| 1624 | 0.486 |
| 1625 | 0.485 |
| 1626 | 0.485 |
| 1627 | 0.484 |
| 1628 | 0.483 |
| 1629 | 0.482 |
| 1630 | 0.481 |
| 1631 | 0.48 |
| 1632 | 0.479 |
| 1633 | 0.478 |
| 1634 | 0.477 |
| 1635 | 0.476 |
| 1636 | 0.475 |
| 1637 | 0.474 |
| 1638 | 0.473 |
| 1639 | 0.472 |
| 1640 | 0.472 |
| 1641 | 0.471 |
| 1642 | 0.47 |
| 1643 | 0.469 |
| 1644 | 0.468 |
| 1645 | 0.467 |
| 1646 | 0.466 |
| 1647 | 0.465 |
| 1648 | 0.464 |
| 1649 | 0.463 |
| 1650 | 0.462 |
| 1651 | 0.461 |
| 1652 | 0.46 |
| 1653 | 0.459 |
| 1654 | 0.458 |
| 1655 | 0.457 |
| 1656 | 0.456 |
| 1657 | 0.455 |
| 1658 | 0.454 |
| 1659 | 0.453 |
| 1660 | 0.452 |
| 1661 | 0.451 |
| 1662 | 0.45 |
| 1663 | 0.449 |
| 1664 | 0.448 |
| 1665 | 0.447 |
| 1666 | 0.446 |
| 1667 | 0.445 |
| 1668 | 0.444 |
| 1669 | 0.443 |
| 1670 | 0.442 |
| 1671 | 0.441 |
| 1672 | 0.44 |
| 1673 | 0.439 |
| 1674 | 0.438 |
| 1675 | 0.437 |
| 1676 | 0.436 |
| 1677 | 0.435 |
| 1678 | 0.434 |
| 1679 | 0.433 |
| 1680 | 0.432 |
| 1681 | 0.431 |
| 1682 | 0.43 |
| 1683 | 0.429 |
| 1684 | 0.428 |
| 1685 | 0.426 |
| 1686 | 0.425 |
| 1687 | 0.424 |
| 1688 | 0.423 |
| 1689 | 0.422 |
| 1690 | 0.421 |
| 1691 | 0.42 |
| 1692 | 0.419 |
| 1693 | 0.418 |
| 1694 | 0.417 |
| 1695 | 0.416 |
| 1696 | 0.415 |
| 1697 | 0.413 |
| 1698 | 0.412 |
| 1699 | 0.411 |
| 1700 | 0.41 |
| 1701 | 0.409 |
| 1702 | 0.408 |
| 1703 | 0.407 |
| 1704 | 0.406 |
| 1705 | 0.404 |
| 1706 | 0.403 |
| 1707 | 0.402 |
| 1708 | 0.401 |
| 1709 | 0.4 |
| 1710 | 0.399 |
| 1711 | 0.398 |
| 1712 | 0.396 |
| 1713 | 0.395 |
| 1714 | 0.394 |
| 1715 | 0.393 |
| 1716 | 0.392 |
| 1717 | 0.391 |
| 1718 | 0.389 |
| 1719 | 0.388 |
| 1720 | 0.387 |
| 1721 | 0.386 |
| 1722 | 0.385 |
| 1723 | 0.383 |
| 1724 | 0.382 |
| 1725 | 0.381 |
| 1726 | 0.38 |
| 1727 | 0.379 |
| 1728 | 0.377 |
| 1729 | 0.376 |
| 1730 | 0.375 |
| 1731 | 0.374 |
| 1732 | 0.372 |
| 1733 | 0.371 |
| 1734 | 0.37 |
| 1735 | 0.369 |
| 1736 | 0.368 |
| 1737 | 0.366 |
| 1738 | 0.365 |
| 1739 | 0.364 |
| 1740 | 0.362 |
| 1741 | 0.361 |
| 1742 | 0.36 |
| 1743 | 0.359 |
| 1744 | 0.357 |
| 1745 | 0.356 |
| 1746 | 0.355 |
| 1747 | 0.353 |
| 1748 | 0.352 |
| 1749 | 0.351 |
| 1750 | 0.349 |
| 1751 | 0.348 |
| 1752 | 0.347 |
| 1753 | 0.345 |
| 1754 | 0.344 |
| 1755 | 0.343 |
| 1756 | 0.341 |
| 1757 | 0.34 |
| 1758 | 0.339 |
| 1759 | 0.337 |
| 1760 | 0.336 |
| 1761 | 0.335 |
| 1762 | 0.333 |
| 1763 | 0.332 |
| 1764 | 0.33 |
| 1765 | 0.329 |
| 1766 | 0.328 |
| 1767 | 0.326 |
| 1768 | 0.325 |
| 1769 | 0.323 |
| 1770 | 0.322 |
| 1771 | 0.32 |
| 1772 | 0.319 |
| 1773 | 0.318 |
| 1774 | 0.316 |
| 1775 | 0.315 |
| 1776 | 0.313 |
| 1777 | 0.312 |
| 1778 | 0.31 |
| 1779 | 0.309 |
| 1780 | 0.307 |
| 1781 | 0.306 |
| 1782 | 0.304 |
| 1783 | 0.303 |
| 1784 | 0.301 |
| 1785 | 0.3 |
| 1786 | 0.298 |
| 1787 | 0.297 |
| 1788 | 0.295 |
| 1789 | 0.293 |
| 1790 | 0.292 |
| 1791 | 0.29 |
| 1792 | 0.289 |
| 1793 | 0.287 |
| 1794 | 0.286 |
| 1795 | 0.284 |
| 1796 | 0.282 |
| 1797 | 0.281 |
| 1798 | 0.279 |
| 1799 | 0.278 |
| 1800 | 0.276 |
| 1801 | 0.274 |
| 1802 | 0.273 |
| 1803 | 0.271 |
| 1804 | 0.269 |
| 1805 | 0.268 |
| 1806 | 0.266 |
| 1807 | 0.264 |
| 1808 | 0.263 |
| 1809 | 0.261 |
| 1810 | 0.259 |
| 1811 | 0.257 |
| 1812 | 0.256 |
| 1813 | 0.254 |
| 1814 | 0.252 |
| 1815 | 0.251 |
| 1816 | 0.249 |
| 1817 | 0.247 |
| 1818 | 0.245 |
| 1819 | 0.244 |
| 1820 | 0.242 |
| 1821 | 0.24 |
| 1822 | 0.238 |
| 1823 | 0.237 |
| 1824 | 0.235 |
| 1825 | 0.233 |
| 1826 | 0.231 |
| 1827 | 0.229 |
| 1828 | 0.228 |
| 1829 | 0.226 |
| 1830 | 0.224 |
| 1831 | 0.222 |
| 1832 | 0.22 |
| 1833 | 0.219 |
| 1834 | 0.217 |
| 1835 | 0.215 |
| 1836 | 0.213 |
| 1837 | 0.211 |
| 1838 | 0.21 |
| 1839 | 0.208 |
| 1840 | 0.206 |
| 1841 | 0.204 |
| 1842 | 0.203 |
| 1843 | 0.201 |
| 1844 | 0.199 |
| 1845 | 0.198 |
| 1846 | 0.196 |
| 1847 | 0.194 |
| 1848 | 0.193 |
| 1849 | 0.191 |
| 1850 | 0.189 |
| 1851 | 0.188 |
| 1852 | 0.186 |
| 1853 | 0.185 |
| 1854 | 0.184 |
| 1855 | 0.182 |
| 1856 | 0.181 |
| 1857 | 0.18 |
| 1858 | 0.179 |
| 1859 | 0.177 |
| 1860 | 0.176 |
| 1861 | 0.175 |
| 1862 | 0.175 |
| 1863 | 0.174 |
| 1864 | 0.173 |
| 1865 | 0.172 |
| 1866 | 0.172 |
| 1867 | 0.171 |
| 1868 | 0.171 |
| 1869 | 0.171 |
| 1870 | 0.17 |
| 1871 | 0.17 |
| 1872 | 0.17 |
| 1873 | 0.171 |
| 1874 | 0.171 |
| 1875 | 0.171 |
| 1876 | 0.171 |
| 1877 | 0.172 |
| 1878 | 0.173 |
| 1879 | 0.173 |
| 1880 | 0.174 |
| 1881 | 0.175 |
| 1882 | 0.176 |
| 1883 | 0.177 |
| 1884 | 0.178 |
| 1885 | 0.179 |
| 1886 | 0.18 |
| 1887 | 0.182 |
| 1888 | 0.183 |
| 1889 | 0.184 |
| 1890 | 0.186 |
| 1891 | 0.187 |
| 1892 | 0.189 |
| 1893 | 0.19 |
| 1894 | 0.192 |
| 1895 | 0.193 |
| 1896 | 0.195 |
| 1897 | 0.197 |
| 1898 | 0.198 |
| 1899 | 0.2 |
| 1900 | 0.202 |
| 1901 | 0.203 |
| 1902 | 0.205 |
| 1903 | 0.207 |
| 1904 | 0.209 |
| 1905 | 0.21 |
| 1906 | 0.212 |
| 1907 | 0.214 |
| 1908 | 0.216 |
| 1909 | 0.218 |
| 1910 | 0.219 |
| 1911 | 0.221 |
| 1912 | 0.223 |
| 1913 | 0.225 |
| 1914 | 0.227 |
| 1915 | 0.228 |
| 1916 | 0.23 |
| 1917 | 0.232 |
| 1918 | 0.234 |
| 1919 | 0.235 |
| 1920 | 0.237 |
| 1921 | 0.239 |
| 1922 | 0.241 |
| 1923 | 0.243 |
| 1924 | 0.244 |
| 1925 | 0.246 |
| 1926 | 0.248 |
| 1927 | 0.25 |
| 1928 | 0.251 |
| 1929 | 0.253 |
| 1930 | 0.255 |
| 1931 | 0.256 |
| 1932 | 0.258 |
| 1933 | 0.26 |
| 1934 | 0.262 |
| 1935 | 0.263 |
| 1936 | 0.265 |
| 1937 | 0.267 |
| 1938 | 0.268 |
| 1939 | 0.27 |
| 1940 | 0.272 |
| 1941 | 0.273 |
| 1942 | 0.275 |
| 1943 | 0.277 |
| 1944 | 0.278 |
| 1945 | 0.28 |
| 1946 | 0.281 |
| 1947 | 0.283 |
| 1948 | 0.285 |
| 1949 | 0.286 |
| 1950 | 0.288 |
| 1951 | 0.289 |
| 1952 | 0.291 |
| 1953 | 0.293 |
| 1954 | 0.294 |
| 1955 | 0.296 |
| 1956 | 0.297 |
| 1957 | 0.299 |
| 1958 | 0.3 |
| 1959 | 0.302 |
| 1960 | 0.303 |
| 1961 | 0.305 |
| 1962 | 0.306 |
| 1963 | 0.308 |
| 1964 | 0.309 |
| 1965 | 0.311 |
| 1966 | 0.312 |
| 1967 | 0.314 |
| 1968 | 0.315 |
| 1969 | 0.317 |
| 1970 | 0.318 |
| 1971 | 0.32 |
| 1972 | 0.321 |
| 1973 | 0.322 |
| 1974 | 0.324 |
| 1975 | 0.325 |
| 1976 | 0.327 |
| 1977 | 0.328 |
| 1978 | 0.33 |
| 1979 | 0.331 |
| 1980 | 0.332 |
| 1981 | 0.334 |
| 1982 | 0.335 |
| 1983 | 0.337 |
| 1984 | 0.338 |
| 1985 | 0.339 |
| 1986 | 0.341 |
| 1987 | 0.342 |
| 1988 | 0.343 |
| 1989 | 0.345 |
| 1990 | 0.346 |
| 1991 | 0.347 |
| 1992 | 0.349 |
| 1993 | 0.35 |
| 1994 | 0.351 |
| 1995 | 0.353 |
| 1996 | 0.354 |
| 1997 | 0.355 |
| 1998 | 0.357 |
| 1999 | 0.358 |